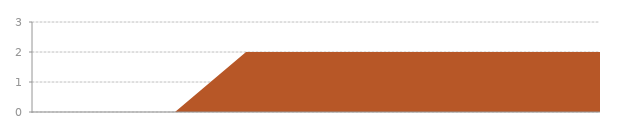
| Category | Series 0 |
|---|---|
| 0 | 0 |
| 1 | 0 |
| 2 | 0 |
| 3 | 2 |
| 4 | 2 |
| 5 | 2 |
| 6 | 2 |
| 7 | 2 |
| 8 | 2 |